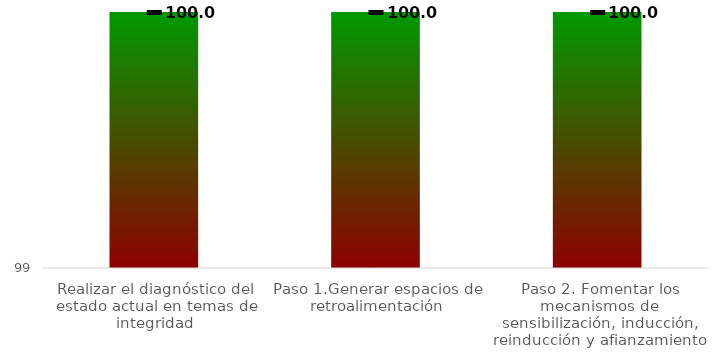
| Category | Niveles |
|---|---|
| Realizar el diagnóstico del estado actual en temas de integridad | 100 |
| Paso 1.Generar espacios de retroalimentación
 | 100 |
| Paso 2. Fomentar los mecanismos de sensibilización, inducción, reinducción y afianzamiento | 100 |